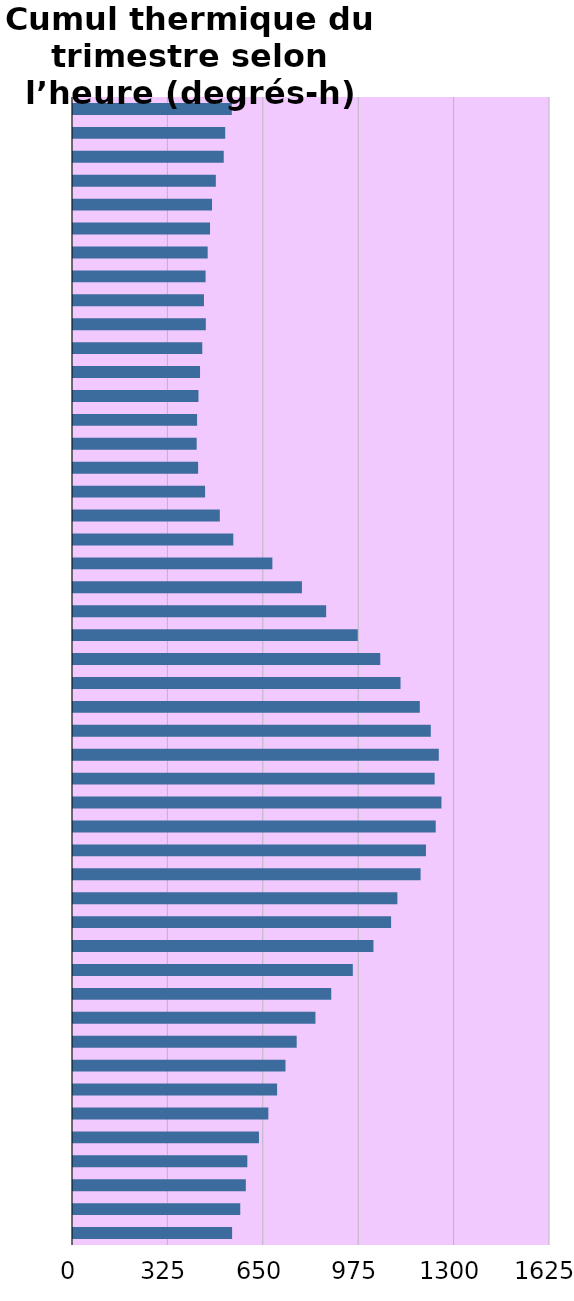
| Category | Sans titre 1 |
|---|---|
| 0:15 | 541 |
| 0:45 | 518.5 |
| 1:15 | 513.5 |
| 1:45 | 486.6 |
| 2:15 | 473.6 |
| 2:45 | 466.8 |
| 3:15 | 458.8 |
| 3:45 | 451.7 |
| 4:15 | 446.1 |
| 4:45 | 452.5 |
| 5:15 | 440.4 |
| 5:45 | 432.8 |
| 6:15 | 427.5 |
| 6:45 | 422.7 |
| 7:15 | 421.3 |
| 7:45 | 426.3 |
| 8:15 | 450 |
| 8:45 | 500.2 |
| 9:15 | 546.1 |
| 9:45 | 679.2 |
| 10:15 | 779.9 |
| 10:45 | 862.4 |
| 11:15 | 970.1 |
| 11:45 | 1046.7 |
| 12:15 | 1115.8 |
| 12:45 | 1181.5 |
| 13:15 | 1218.9 |
| 13:45 | 1246.2 |
| 14:15 | 1232.1 |
| 14:45 | 1255.2 |
| 15:15 | 1235.7 |
| 15:45 | 1202.4 |
| 16:15 | 1184.1 |
| 16:45 | 1105.1 |
| 17:15 | 1083.7 |
| 17:45 | 1023.6 |
| 18:15 | 953.3 |
| 18:45 | 879.8 |
| 19:15 | 825.9 |
| 19:45 | 762 |
| 20:15 | 723.9 |
| 20:45 | 695.3 |
| 21:15 | 665.5 |
| 21:45 | 633.5 |
| 22:15 | 593.9 |
| 22:45 | 588.8 |
| 23:15 | 569.8 |
| 23:45 | 542.1 |